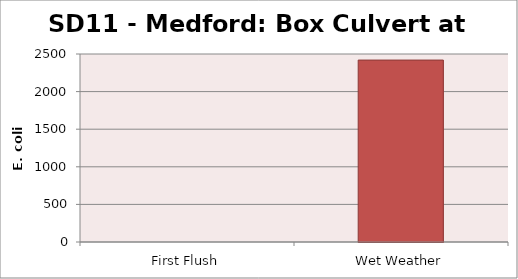
| Category | E. coli MPN - |
|---|---|
| First Flush | 0 |
| Wet Weather | 2419.2 |